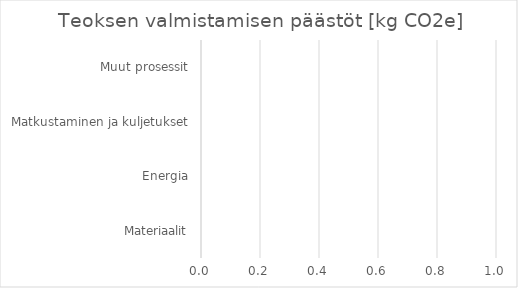
| Category | Series 0 |
|---|---|
| Materiaalit | 0 |
| Energia | 0 |
| Matkustaminen ja kuljetukset | 0 |
| Muut prosessit | 0 |